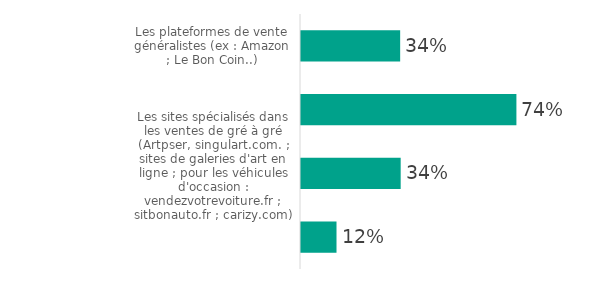
| Category | Series 0 |
|---|---|
| Les plateformes de vente généralistes (ex : Amazon ; Le Bon Coin..) | 33.96 |
| Les sites de courtage d'enchères en ligne (ex : e-bay, Catawiki.fr..) | 73.773 |
| Les sites spécialisés dans les ventes de gré à gré (Artpser, singulart.com. ; sites de galeries d'art en ligne ; pour les véhicules d'occasion : vendezvotrevoiture.fr ; sitbonauto.fr ; carizy.com) | 34.136 |
| Autre | 12.158 |